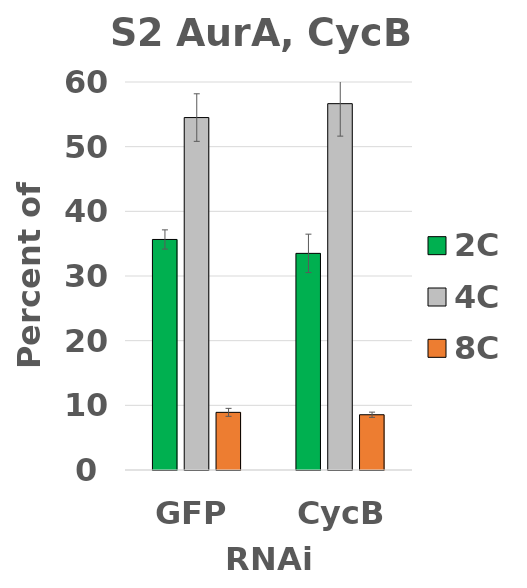
| Category | 2C | 4C | 8C |
|---|---|---|---|
| GFP | 35.65 | 54.5 | 8.915 |
| CycB | 33.5 | 56.65 | 8.545 |